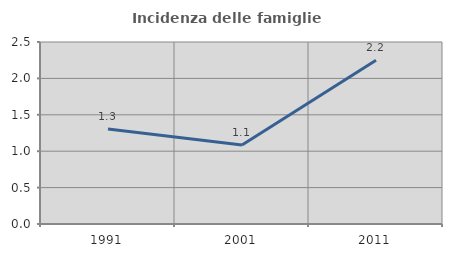
| Category | Incidenza delle famiglie numerose |
|---|---|
| 1991.0 | 1.306 |
| 2001.0 | 1.087 |
| 2011.0 | 2.249 |